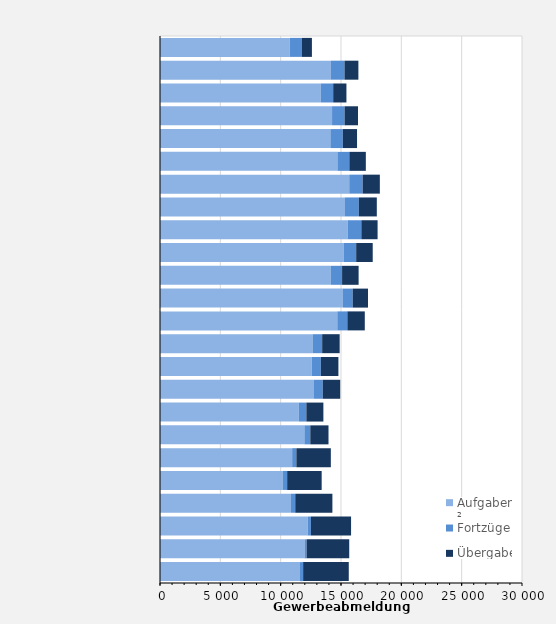
| Category | Aufgaben² | Fortzüge | Übergaben |
|---|---|---|---|
| 1997.0 | 11603 | 259 | 3782 |
| 1998.0 | 11976 | 177 | 3529 |
| 1999.0 | 12240 | 268 | 3326 |
| 2000.0 | 10853 | 356 | 3078 |
| 2001.0 | 10187 | 351 | 2860 |
| 2002.0 | 10953 | 348 | 2857 |
| 2003.0 | 11965 | 490 | 1509 |
| 2004.0 | 11504 | 625 | 1411 |
| 2005.0 | 12763 | 724 | 1449 |
| 2006.0 | 12576 | 755 | 1454 |
| 2007.0 | 12642 | 796 | 1452 |
| 2008.0 | 14693 | 834 | 1445 |
| 2009.0 | 15163 | 805 | 1272 |
| 2010.0 | 14163 | 926 | 1371 |
| 2011.0 | 15213 | 1043 | 1373 |
| 2012.0 | 15567 | 1119 | 1346 |
| 2013.0 | 15333 | 1147 | 1488 |
| 2014.0 | 15684 | 1109 | 1426 |
| 2015.0 | 14703 | 988 | 1367 |
| 2016.0 | 14120 | 1028 | 1181 |
| 2017.0 | 14259 | 1036 | 1112 |
| 2018.0 | 13328 | 1024 | 1098 |
| 2019.0 | 14135 | 1155 | 1151 |
| 2020.0 | 10752 | 1017 | 820 |